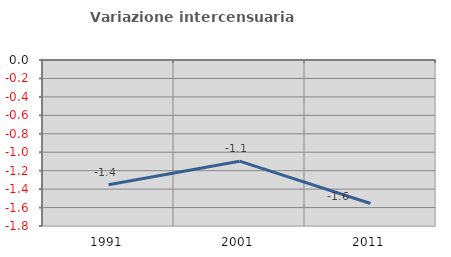
| Category | Variazione intercensuaria annua |
|---|---|
| 1991.0 | -1.353 |
| 2001.0 | -1.097 |
| 2011.0 | -1.556 |